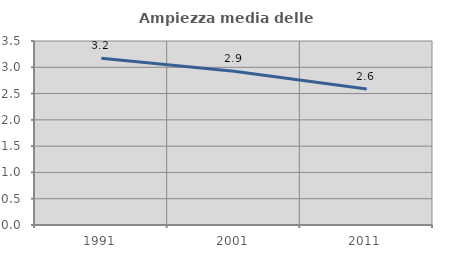
| Category | Ampiezza media delle famiglie |
|---|---|
| 1991.0 | 3.171 |
| 2001.0 | 2.923 |
| 2011.0 | 2.585 |